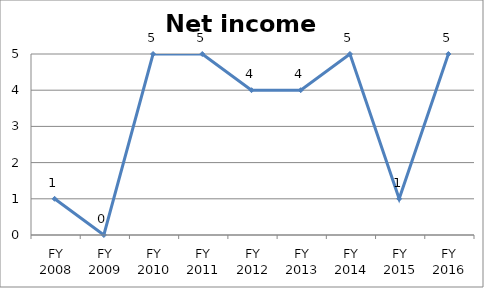
| Category | Net income score |
|---|---|
| FY 2016 | 5 |
| FY 2015 | 1 |
| FY 2014 | 5 |
| FY 2013 | 4 |
| FY 2012 | 4 |
| FY 2011 | 5 |
| FY 2010 | 5 |
| FY 2009 | 0 |
| FY 2008 | 1 |